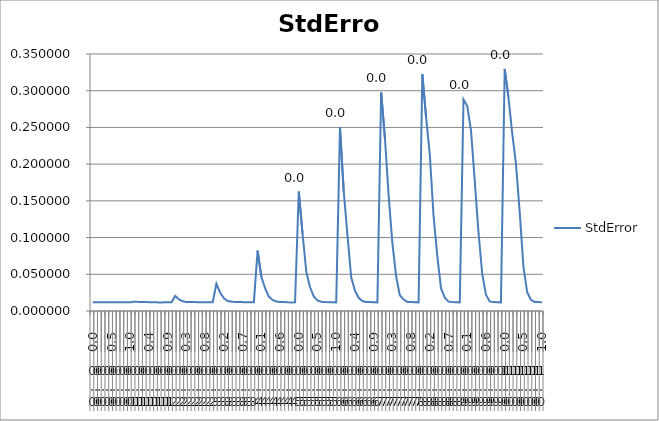
| Category | StdError |
|---|---|
| 0 | 0.012 |
| 1 | 0.012 |
| 2 | 0.012 |
| 3 | 0.012 |
| 4 | 0.012 |
| 5 | 0.012 |
| 6 | 0.012 |
| 7 | 0.012 |
| 8 | 0.012 |
| 9 | 0.012 |
| 10 | 0.012 |
| 11 | 0.013 |
| 12 | 0.012 |
| 13 | 0.012 |
| 14 | 0.012 |
| 15 | 0.012 |
| 16 | 0.012 |
| 17 | 0.012 |
| 18 | 0.012 |
| 19 | 0.012 |
| 20 | 0.012 |
| 21 | 0.012 |
| 22 | 0.021 |
| 23 | 0.016 |
| 24 | 0.013 |
| 25 | 0.012 |
| 26 | 0.012 |
| 27 | 0.012 |
| 28 | 0.012 |
| 29 | 0.012 |
| 30 | 0.012 |
| 31 | 0.012 |
| 32 | 0.012 |
| 33 | 0.037 |
| 34 | 0.025 |
| 35 | 0.017 |
| 36 | 0.014 |
| 37 | 0.013 |
| 38 | 0.012 |
| 39 | 0.012 |
| 40 | 0.012 |
| 41 | 0.012 |
| 42 | 0.012 |
| 43 | 0.012 |
| 44 | 0.082 |
| 45 | 0.047 |
| 46 | 0.031 |
| 47 | 0.02 |
| 48 | 0.015 |
| 49 | 0.013 |
| 50 | 0.012 |
| 51 | 0.012 |
| 52 | 0.012 |
| 53 | 0.012 |
| 54 | 0.012 |
| 55 | 0.163 |
| 56 | 0.106 |
| 57 | 0.054 |
| 58 | 0.032 |
| 59 | 0.02 |
| 60 | 0.014 |
| 61 | 0.013 |
| 62 | 0.012 |
| 63 | 0.012 |
| 64 | 0.012 |
| 65 | 0.012 |
| 66 | 0.25 |
| 67 | 0.163 |
| 68 | 0.103 |
| 69 | 0.046 |
| 70 | 0.028 |
| 71 | 0.018 |
| 72 | 0.014 |
| 73 | 0.012 |
| 74 | 0.012 |
| 75 | 0.012 |
| 76 | 0.012 |
| 77 | 0.298 |
| 78 | 0.236 |
| 79 | 0.157 |
| 80 | 0.093 |
| 81 | 0.047 |
| 82 | 0.022 |
| 83 | 0.016 |
| 84 | 0.012 |
| 85 | 0.012 |
| 86 | 0.012 |
| 87 | 0.012 |
| 88 | 0.322 |
| 89 | 0.264 |
| 90 | 0.213 |
| 91 | 0.129 |
| 92 | 0.075 |
| 93 | 0.031 |
| 94 | 0.018 |
| 95 | 0.013 |
| 96 | 0.012 |
| 97 | 0.012 |
| 98 | 0.012 |
| 99 | 0.288 |
| 100 | 0.279 |
| 101 | 0.246 |
| 102 | 0.178 |
| 103 | 0.107 |
| 104 | 0.05 |
| 105 | 0.022 |
| 106 | 0.013 |
| 107 | 0.012 |
| 108 | 0.012 |
| 109 | 0.012 |
| 110 | 0.33 |
| 111 | 0.291 |
| 112 | 0.243 |
| 113 | 0.201 |
| 114 | 0.135 |
| 115 | 0.061 |
| 116 | 0.026 |
| 117 | 0.015 |
| 118 | 0.012 |
| 119 | 0.012 |
| 120 | 0.012 |